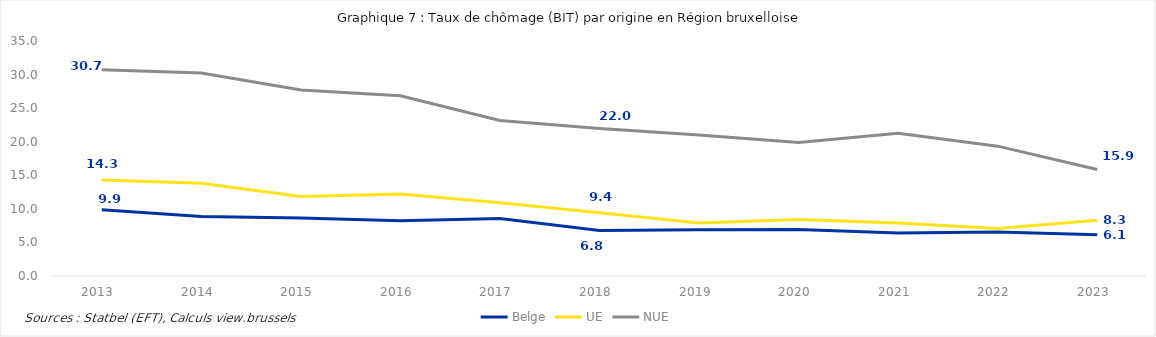
| Category | Belge | UE | NUE |
|---|---|---|---|
| 2013.0 | 9.881 | 14.293 | 30.709 |
| 2014.0 | 8.868 | 13.823 | 30.24 |
| 2015.0 | 8.657 | 11.85 | 27.717 |
| 2016.0 | 8.237 | 12.213 | 26.85 |
| 2017.0 | 8.549 | 10.925 | 23.155 |
| 2018.0 | 6.776 | 9.407 | 21.976 |
| 2019.0 | 6.872 | 7.902 | 20.999 |
| 2020.0 | 6.938 | 8.409 | 19.897 |
| 2021.0 | 6.39 | 7.888 | 21.248 |
| 2022.0 | 6.538 | 7.064 | 19.34 |
| 2023.0 | 6.126 | 8.312 | 15.873 |